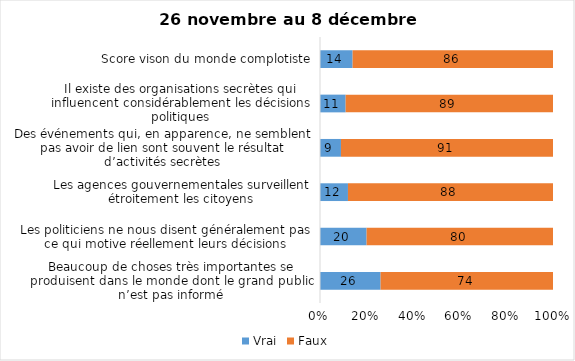
| Category | Vrai | Faux |
|---|---|---|
| Beaucoup de choses très importantes se produisent dans le monde dont le grand public n’est pas informé | 26 | 74 |
| Les politiciens ne nous disent généralement pas ce qui motive réellement leurs décisions | 20 | 80 |
| Les agences gouvernementales surveillent étroitement les citoyens | 12 | 88 |
| Des événements qui, en apparence, ne semblent pas avoir de lien sont souvent le résultat d’activités secrètes | 9 | 91 |
| Il existe des organisations secrètes qui influencent considérablement les décisions politiques | 11 | 89 |
| Score vison du monde complotiste | 14 | 86 |